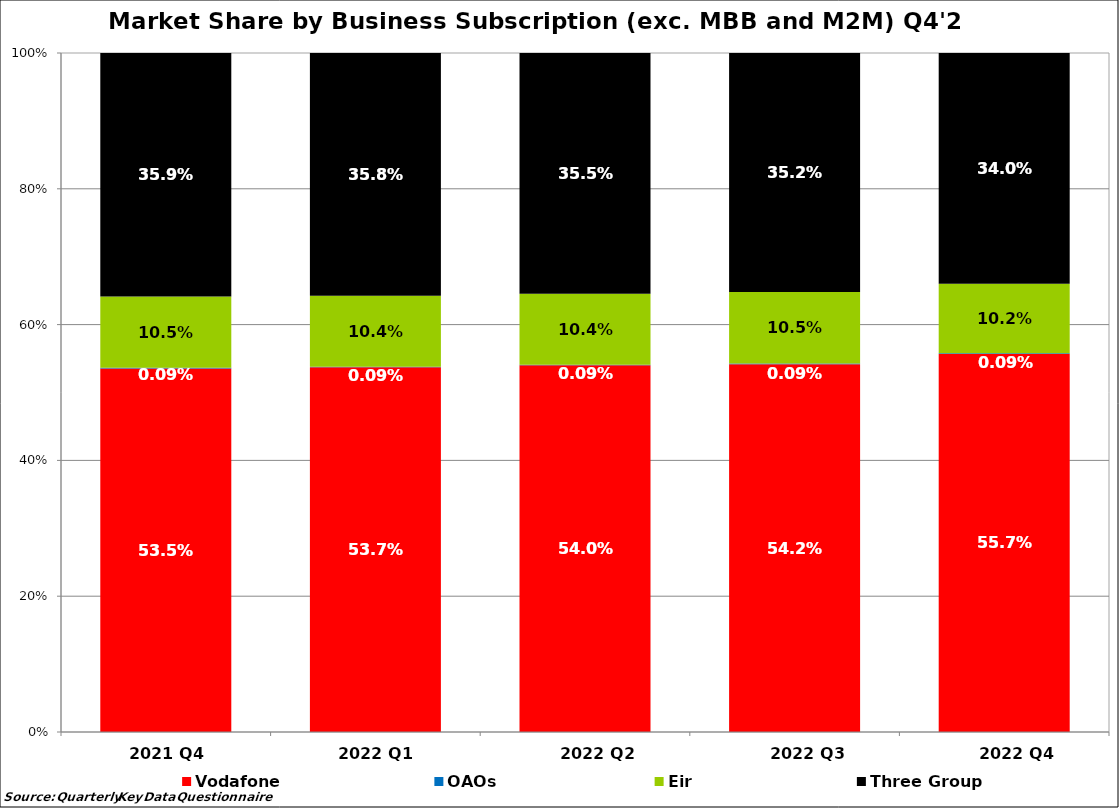
| Category | Vodafone | OAOs | Eir  | Three Group |
|---|---|---|---|---|
| 2021 Q4  | 0.535 | 0.001 | 0.105 | 0.359 |
| 2022 Q1  | 0.537 | 0.001 | 0.104 | 0.358 |
| 2022 Q2 | 0.54 | 0.001 | 0.104 | 0.355 |
| 2022 Q3 | 0.542 | 0.001 | 0.105 | 0.352 |
| 2022 Q4 | 0.557 | 0.001 | 0.102 | 0.34 |